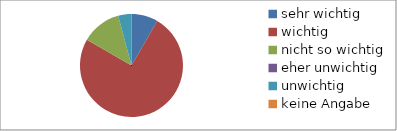
| Category | Series 0 |
|---|---|
| sehr wichtig | 2 |
| wichtig | 18 |
| nicht so wichtig | 3 |
| eher unwichtig | 0 |
| unwichtig | 1 |
| keine Angabe | 0 |